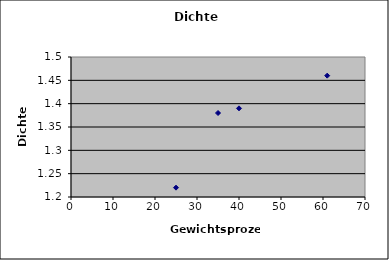
| Category | Series 0 |
|---|---|
| 25.0 | 1.22 |
| 35.0 | 1.38 |
| 40.0 | 1.39 |
| 61.0 | 1.46 |